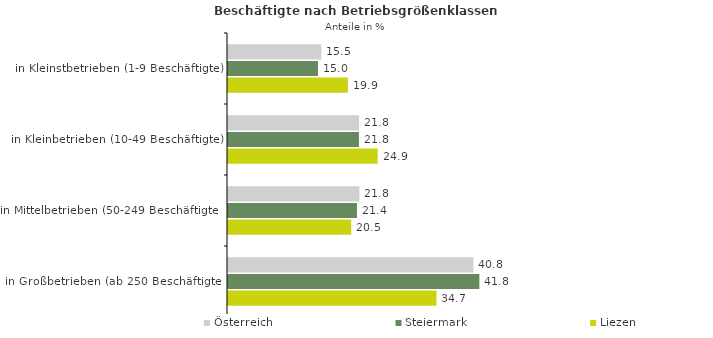
| Category | Österreich | Steiermark | Liezen |
|---|---|---|---|
| in Kleinstbetrieben (1-9 Beschäftigte) | 15.526 | 14.966 | 19.934 |
| in Kleinbetrieben (10-49 Beschäftigte) | 21.796 | 21.781 | 24.9 |
| in Mittelbetrieben (50-249 Beschäftigte) | 21.849 | 21.447 | 20.493 |
| in Großbetrieben (ab 250 Beschäftigte) | 40.829 | 41.806 | 34.673 |